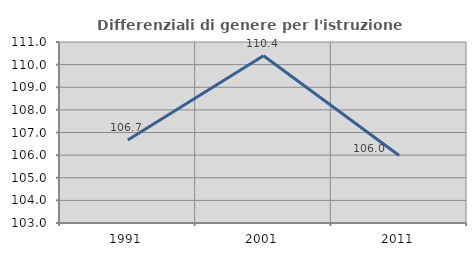
| Category | Differenziali di genere per l'istruzione superiore |
|---|---|
| 1991.0 | 106.672 |
| 2001.0 | 110.393 |
| 2011.0 | 105.985 |